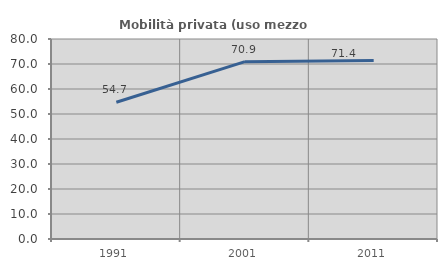
| Category | Mobilità privata (uso mezzo privato) |
|---|---|
| 1991.0 | 54.685 |
| 2001.0 | 70.932 |
| 2011.0 | 71.406 |